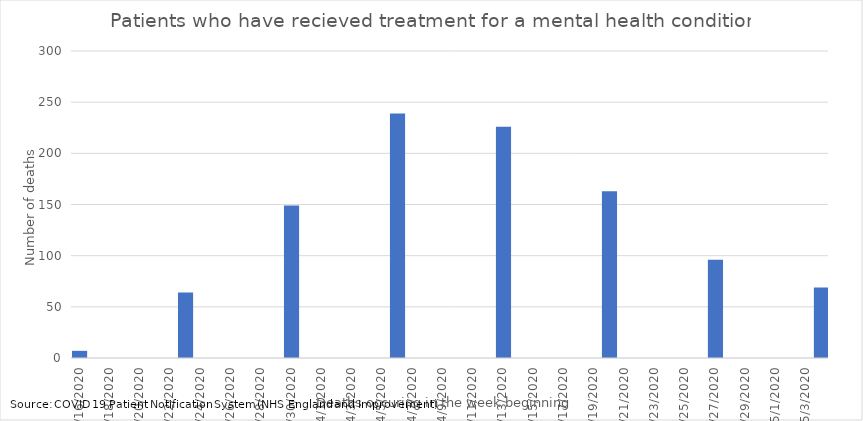
| Category | Number of cases |
|---|---|
| 16/03/2020 | 7 |
| 23/03/2020 | 64 |
| 30/03/2020 | 149 |
| 06/04/2020 | 239 |
| 13/04/2020 | 226 |
| 20/04/2020 | 163 |
| 27/04/2020 | 96 |
| 04/05/2020 | 69 |